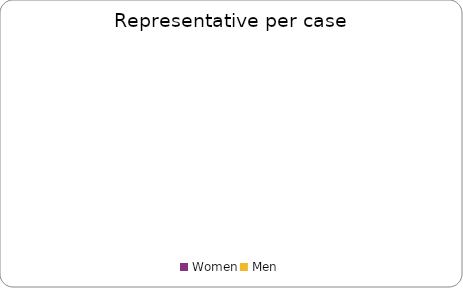
| Category | Series 0 |
|---|---|
| Women | 0 |
| Men | 0 |